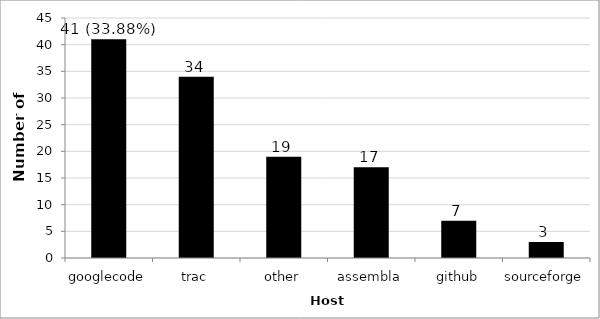
| Category | Ergebnis |
|---|---|
| googlecode | 41 |
| trac | 34 |
| other | 19 |
| assembla | 17 |
| github | 7 |
| sourceforge | 3 |